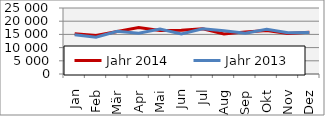
| Category | Jahr 2014 | Jahr 2013 |
|---|---|---|
| Jan | 15269.383 | 14864.512 |
| Feb | 14555.609 | 13948.912 |
| Mär | 16100.901 | 16153.979 |
| Apr | 17571.93 | 15424.787 |
| Mai | 16468.565 | 17025.367 |
| Jun | 16529.202 | 15152.896 |
| Jul | 17144.311 | 17165.839 |
| Aug | 15166.011 | 16425.797 |
| Sep | 15954.843 | 15447.013 |
| Okt | 16484.318 | 16902.581 |
| Nov | 15368.768 | 15627.132 |
| Dez | 15782.054 | 15725.042 |